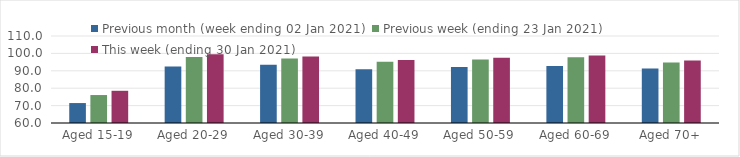
| Category | Previous month (week ending 02 Jan 2021) | Previous week (ending 23 Jan 2021) | This week (ending 30 Jan 2021) |
|---|---|---|---|
| Aged 15-19 | 71.46 | 76.07 | 78.51 |
| Aged 20-29 | 92.47 | 97.97 | 99.51 |
| Aged 30-39 | 93.45 | 97.04 | 98.29 |
| Aged 40-49 | 90.95 | 95.26 | 96.26 |
| Aged 50-59 | 92.15 | 96.45 | 97.54 |
| Aged 60-69 | 92.74 | 97.8 | 98.82 |
| Aged 70+ | 91.26 | 94.79 | 95.92 |